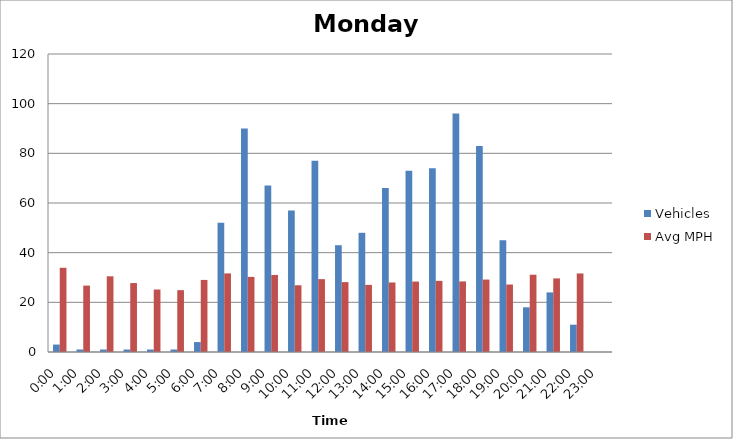
| Category | Vehicles | Avg MPH |
|---|---|---|
| 0:00 | 3 | 33.92 |
| 1:00 | 1 | 26.74 |
| 2:00 | 1 | 30.49 |
| 3:00 | 1 | 27.76 |
| 4:00 | 1 | 25.16 |
| 5:00 | 1 | 24.9 |
| 6:00 | 4 | 29.03 |
| 7:00 | 52 | 31.65 |
| 8:00 | 90 | 30.24 |
| 9:00 | 67 | 31.02 |
| 10:00 | 57 | 26.87 |
| 11:00 | 77 | 29.34 |
| 12:00 | 43 | 28.14 |
| 13:00 | 48 | 27.04 |
| 14:00 | 66 | 28 |
| 15:00 | 73 | 28.36 |
| 16:00 | 74 | 28.65 |
| 17:00 | 96 | 28.42 |
| 18:00 | 83 | 29.17 |
| 19:00 | 45 | 27.17 |
| 20:00 | 18 | 31.12 |
| 21:00 | 24 | 29.64 |
| 22:00 | 11 | 31.63 |
| 23:00 | 0 | 0 |